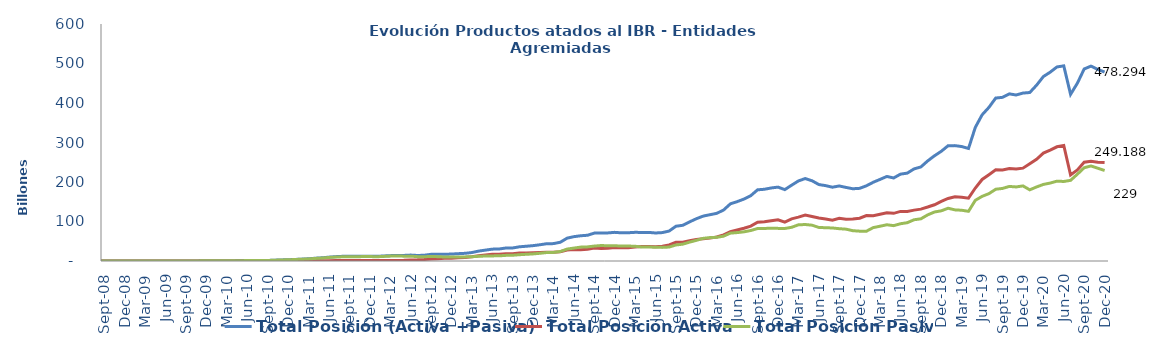
| Category | Total Posición (Activa +Pasiva) | Total Posición Activa | Total Posición Pasiva |
|---|---|---|---|
| 2008-07-01 | 0 | 0 | 0 |
| 2008-08-01 | 0 | 0 | 0 |
| 2008-09-01 | 1000000 | 0 | 1000000 |
| 2008-10-01 | 1000000 | 0 | 1000000 |
| 2008-11-01 | 0 | 0 | 0 |
| 2008-12-01 | 0 | 0 | 0 |
| 2009-01-01 | 0 | 0 | 0 |
| 2009-02-01 | 7428500000 | 7428500000 | 0 |
| 2009-03-01 | 7428500000 | 7428500000 | 0 |
| 2009-04-01 | 7428500000 | 7428500000 | 0 |
| 2009-05-01 | 7428500000 | 7428500000 | 0 |
| 2009-06-01 | 7428500000 | 7428500000 | 0 |
| 2009-07-01 | 184628500000 | 7428500000 | 177200000000 |
| 2009-08-01 | 184628500000 | 7428500000 | 177200000000 |
| 2009-09-01 | 184628500000 | 7428500000 | 177200000000 |
| 2009-10-01 | 185129500000 | 7928500000 | 177201000000 |
| 2009-11-01 | 333829500000 | 22928500000 | 310901000000 |
| 2009-12-01 | 508529500000 | 22928500000 | 485601000000 |
| 2010-01-01 | 523329500000 | 23328500000 | 500001000000 |
| 2010-02-01 | 561579500000 | 23328500000 | 538251000000 |
| 2010-03-01 | 890799500000 | 24228500000 | 866571000000 |
| 2010-04-01 | 934149500000 | 32228500000 | 901921000000 |
| 2010-05-01 | 972149500000 | 46928500000 | 925221000000 |
| 2010-06-01 | 1019749500000 | 57928500000 | 961821000000 |
| 2010-07-01 | 1054749500000 | 71928500000 | 982821000000 |
| 2010-08-01 | 1096821000000 | 66500000000 | 1030321000000 |
| 2010-09-01 | 1351421000000 | 57500000000 | 1293921000000 |
| 2010-10-01 | 2086289000000 | 111000000000 | 1975289000000 |
| 2010-11-01 | 2726579030230 | 114000000000 | 2612579030230 |
| 2010-12-01 | 3205380030230 | 113971000000 | 3091409030230 |
| 2011-01-01 | 3891216030230 | 114971000000 | 3776245030230 |
| 2011-02-01 | 4740024311520 | 219471000000 | 4520553311520 |
| 2011-03-01 | 5575075311520 | 377371000000 | 5197704311520 |
| 2011-04-01 | 7038592281290 | 509371000000 | 6529221281290 |
| 2011-05-01 | 8099489881774 | 597145000000 | 7502344881774 |
| 2011-06-01 | 9725086346191 | 765169000000 | 8959917346191 |
| 2011-07-01 | 10999513570652 | 996669000000 | 10002844570652 |
| 2011-08-01 | 11811490085668 | 1214169000000 | 10597321085668 |
| 2011-09-01 | 12092316282168 | 1148069000000 | 10944247282168 |
| 2011-10-01 | 11974470459718 | 1135571874050 | 10838898585668 |
| 2011-11-01 | 12176418287184 | 984599000000 | 11191819287184 |
| 2011-12-01 | 12288842763684 | 983099000000 | 11305743763684 |
| 2012-01-01 | 11701287811238 | 1008599000000 | 10692688811238 |
| 2012-02-01 | 12706230411238 | 1105569000000 | 11600661411238 |
| 2012-03-01 | 13561575207334 | 1160099000000 | 12401476207334 |
| 2012-04-01 | 14046325467338 | 1471099000000 | 12575226467338 |
| 2012-05-01 | 14094647073338 | 1804949000000 | 12289698073338 |
| 2012-06-01 | 14980264763536 | 2682753000000 | 12297511763536 |
| 2012-07-01 | 13983506536392.6 | 2975989400932.6 | 11007517135460 |
| 2012-08-01 | 14511342381537.73 | 3747251409383.73 | 10764090972154 |
| 2012-09-01 | 16937362887762.46 | 5346076915608.46 | 11591285972154 |
| 2012-10-01 | 16867323467297.76 | 5927222995143.76 | 10940100472154 |
| 2012-11-01 | 16957687120024.45 | 6827721606539.45 | 10129965513485 |
| 2012-12-01 | 17619213721064.83 | 7264421085065.83 | 10354792635999 |
| 2013-01-01 | 18549778788681.95 | 8296359799905.279 | 10253418988776.67 |
| 2013-02-01 | 19435840251568.38 | 9025528305106.379 | 10410311946462 |
| 2013-03-01 | 21350496757475.97 | 10610182541484.97 | 10740314215991 |
| 2013-04-01 | 25044328892886.617 | 13133059577950.62 | 11911269314936 |
| 2013-05-01 | 27540403190960.062 | 14960233266686.31 | 12580169924273.75 |
| 2013-06-01 | 30001766547101.754 | 17049524776131 | 12952241770970.75 |
| 2013-07-01 | 30415841990108.754 | 17382486278583 | 13033355711525.75 |
| 2013-08-01 | 32855099846458.246 | 18580739748972 | 14274360097486.25 |
| 2013-09-01 | 32976502369371.246 | 18407429561787 | 14569072807584.25 |
| 2013-10-01 | 35959569368735.19 | 19992346917073.383 | 15967222451661.8 |
| 2013-11-01 | 37338647357799.75 | 20384941433230.95 | 16953705924568.8 |
| 2013-12-01 | 38888505779144.55 | 20939970782609.754 | 17948534996534.8 |
| 2014-01-01 | 41103172396366.16 | 21609706461008.36 | 19493465935357.8 |
| 2014-02-01 | 43730091166840.81 | 22338455450529.008 | 21391635716311.8 |
| 2014-03-01 | 44014768230115.07 | 22272030193312.27 | 21742738036802.8 |
| 2014-04-01 | 47430724239336.83 | 23422937479203.03 | 24007786760133.8 |
| 2014-05-01 | 57834426276868.516 | 27674659964612.28 | 30159766312256.23 |
| 2014-06-01 | 61600955025680.43 | 28872171652456.2 | 32728783373224.23 |
| 2014-07-01 | 63885132140809.125 | 28702458561582.03 | 35182673579227.09 |
| 2014-08-01 | 65175133555848.31 | 29435167088741.88 | 35739966467106.44 |
| 2014-09-01 | 70606691467799.84 | 32831024190733.098 | 37775667277066.74 |
| 2014-10-01 | 71051997442592.78 | 31855183242802.297 | 39196814199790.49 |
| 2014-11-01 | 71115134748566.56 | 32585871229814.906 | 38529263518751.65 |
| 2014-12-01 | 72525676073088.9 | 33921493945222.32 | 38604182127866.58 |
| 2015-01-01 | 71271574040027.69 | 33430948122193.57 | 37840625917834.125 |
| 2015-02-01 | 71566513266069.4 | 33707551044151.4 | 37858962221918 |
| 2015-03-01 | 72569028292197.1 | 35240251694194.734 | 37328776598002.37 |
| 2015-04-01 | 72284407635002.38 | 36978226535327.29 | 35306181099675.08 |
| 2015-05-01 | 72379825993554.31 | 36677826813740.74 | 35701999179813.58 |
| 2015-06-01 | 70934232494211.97 | 36341054921697.64 | 34593177572514.32 |
| 2015-07-01 | 71925911515818.6 | 37449597485067.67 | 34476314030750.92 |
| 2015-08-01 | 75819411537731.48 | 40476268719214.67 | 35343142818516.81 |
| 2015-09-01 | 88024514896767.1 | 47423423192943 | 40601091703824.09 |
| 2015-10-01 | 90376727278611.56 | 47767203933521.14 | 42609523345090.43 |
| 2015-11-01 | 99012993745053.11 | 51298569770898.03 | 47714423974155.08 |
| 2015-12-01 | 107008749487979.02 | 54758099038919.11 | 52250650449059.89 |
| 2016-01-01 | 113661574588642.9 | 56331160756973.97 | 57330413831668.94 |
| 2016-02-01 | 117225015006954.34 | 57909509197116.14 | 59315505809838.21 |
| 2016-03-01 | 120669820452450.66 | 60722748977001.484 | 59947071475449.17 |
| 2016-04-01 | 129040983634768.84 | 66178255126135.42 | 62862728508633.42 |
| 2016-05-01 | 144700379703761.53 | 74162617699926 | 70537762003835.53 |
| 2016-06-01 | 150304379111854.44 | 78377250605963.84 | 71927128505890.6 |
| 2016-07-01 | 156812723823687.1 | 82955508331840.11 | 73857215491846.98 |
| 2016-08-01 | 165444572236951 | 88276550125987.88 | 77168022110963.12 |
| 2016-09-01 | 180247481204752.16 | 97990348411005.16 | 82257132793747.02 |
| 2016-10-01 | 181569726283085.44 | 99190320785310.78 | 82379405497774.64 |
| 2016-11-01 | 184930356175967.25 | 101858145365331.95 | 83072210810635.31 |
| 2016-12-01 | 187019078701499.56 | 104426020271926.45 | 82593058429573.12 |
| 2017-01-01 | 180717599779259.44 | 98342098801930.34 | 82375500977329.1 |
| 2017-02-01 | 191914936110978.38 | 106635932569865.05 | 85279003541113.31 |
| 2017-03-01 | 202712151186918.75 | 111093841827062.03 | 91618309359856.7 |
| 2017-04-01 | 208712921786598.44 | 116358628666288.72 | 92354293120309.72 |
| 2017-05-01 | 203156118525042.3 | 112464530045620.02 | 90691588479422.28 |
| 2017-06-01 | 193587897232076.56 | 108642745845616.36 | 84945151386460.22 |
| 2017-07-01 | 190785975919763.38 | 106534349795344.66 | 84251626124418.72 |
| 2017-08-01 | 186835458365348.25 | 103243442359903.69 | 83592016005444.58 |
| 2017-09-01 | 189956082995096.8 | 108148190109574.17 | 81807892885522.62 |
| 2017-10-01 | 186238156699396.06 | 105639300759532 | 80598855939864.06 |
| 2017-11-01 | 182912971216385.97 | 106198065459860.58 | 76714905756525.44 |
| 2017-12-01 | 183933570178700.62 | 108408970543558.03 | 75524599635142.58 |
| 2018-01-01 | 190424775932458.47 | 114943825229509.72 | 75480950702948.75 |
| 2018-02-01 | 199397563470704.5 | 114794441925964.78 | 84603121544739.73 |
| 2018-03-01 | 206599379846535.78 | 118542976386628.56 | 88056403459907.22 |
| 2018-04-01 | 214049245063754.12 | 122316493524125.72 | 91732751539628.39 |
| 2018-05-01 | 210207792880960.06 | 120682410832846.97 | 89525382048113.08 |
| 2018-06-01 | 219901855771780.88 | 125584292257677.75 | 94317563514103.12 |
| 2018-07-01 | 222464661118893.2 | 125490160168957.62 | 96974500949935.58 |
| 2018-08-01 | 233197164382865.06 | 128762857401461.97 | 104434306981403.1 |
| 2018-09-01 | 238138413897634.5 | 131365417268308.8 | 106772996629325.72 |
| 2018-10-01 | 253384775618417.97 | 136616212577415.81 | 116768563041002.19 |
| 2018-11-01 | 266418937717877.38 | 142363157445231.12 | 124055780272646.25 |
| 2018-12-01 | 277772721069584.12 | 150720411980092.44 | 127052309089491.69 |
| 2019-01-01 | 291858612471002.9 | 158283758995387.56 | 133574853475615.28 |
| 2019-02-01 | 292101641913975.5 | 162644666424391.3 | 129456975489584.22 |
| 2019-03-01 | 289727416506685.4 | 161249314539374.06 | 128478101967311.33 |
| 2019-04-01 | 284896810837116.56 | 159138639592346.12 | 125758171244770.44 |
| 2019-05-01 | 338346503446509.75 | 184718287806282.9 | 153628215640226.88 |
| 2019-06-01 | 370093564258665.06 | 206410540298487.2 | 163683023960177.88 |
| 2019-07-01 | 388961974809432.4 | 218450632039062.62 | 170511342770369.75 |
| 2019-08-01 | 412556863802076.9 | 230894872814072.1 | 181661990988004.75 |
| 2019-09-01 | 414341203404225.75 | 230584707366943.97 | 183756496037281.8 |
| 2019-10-01 | 423121599152430.5 | 234315054373881.84 | 188806544778548.62 |
| 2019-11-01 | 420297583715940.25 | 232795683034519.5 | 187501900681420.72 |
| 2019-12-01 | 425121786712055.25 | 235038128039683.3 | 190083658672371.9 |
| 2020-01-01 | 426547897466937.5 | 246349564127442.88 | 180198333339494.62 |
| 2020-02-01 | 445018952183878.6 | 257565523319233.88 | 187453428864644.78 |
| 2020-03-01 | 466911496843937.6 | 273083281549358.03 | 193828215294579.6 |
| 2020-04-01 | 478019247839794.7 | 280730950654356 | 197288297185438.7 |
| 2020-05-01 | 491300192942194.5 | 289149166740985.6 | 202151026201208.84 |
| 2020-06-01 | 494007148887326.4 | 292653603271972.06 | 201353545615354.28 |
| 2020-07-01 | 421901815178981 | 217731615913600.44 | 204170199265380.6 |
| 2020-08-01 | 450161698779021.8 | 230373856062895 | 219787842716126.8 |
| 2020-09-01 | 486157406122476.75 | 250045295329878.06 | 236112110792598.72 |
| 2020-10-01 | 493373162314760.5 | 252769702045015.75 | 240603460269744.75 |
| 2020-11-01 | 485081126051623.6 | 250153355046954.06 | 234927771004669.53 |
| 2020-12-01 | 478293575994438.06 | 249187844056422.62 | 229105731938015.44 |